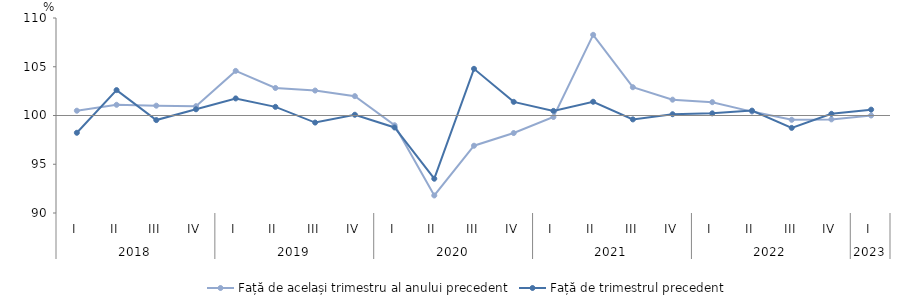
| Category | Față de același trimestru al anului precedent | Față de trimestrul precedent |
|---|---|---|
| 0 | 100.491 | 98.228 |
| 1 | 101.097 | 102.604 |
| 2 | 101.008 | 99.53 |
| 3 | 100.954 | 100.639 |
| 4 | 104.574 | 101.751 |
| 5 | 102.823 | 100.886 |
| 6 | 102.56 | 99.275 |
| 7 | 101.986 | 100.076 |
| 8 | 99 | 98.772 |
| 9 | 91.8 | 93.516 |
| 10 | 96.9 | 104.788 |
| 11 | 98.2 | 101.4 |
| 12 | 99.847 | 100.472 |
| 13 | 108.274 | 101.409 |
| 14 | 102.9 | 99.6 |
| 15 | 101.623 | 100.13 |
| 16 | 101.369 | 100.22 |
| 17 | 100.4 | 100.5 |
| 18 | 99.559 | 98.729 |
| 19 | 99.601 | 100.173 |
| 20 | 100 | 100.6 |